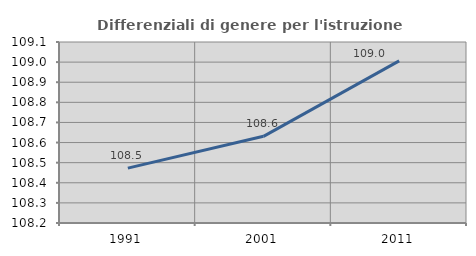
| Category | Differenziali di genere per l'istruzione superiore |
|---|---|
| 1991.0 | 108.473 |
| 2001.0 | 108.631 |
| 2011.0 | 109.006 |